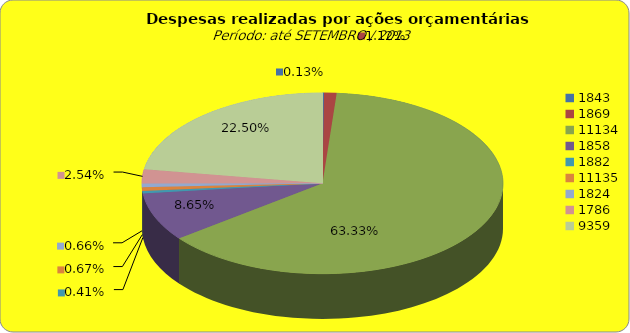
| Category | Series 1 |
|---|---|
| 1843.0 | 161802.31 |
| 1869.0 | 1372248.6 |
| 11134.0 | 77585467.16 |
| 1858.0 | 10592762.77 |
| 1882.0 | 503655.42 |
| 11135.0 | 815053.99 |
| 1824.0 | 806188.23 |
| 1786.0 | 3111046.84 |
| 9359.0 | 27570510.84 |